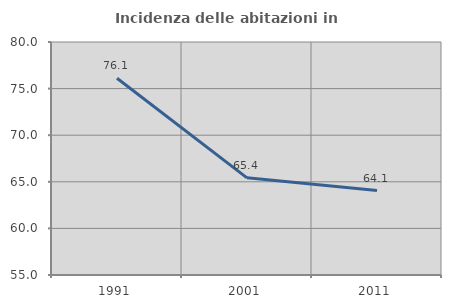
| Category | Incidenza delle abitazioni in proprietà  |
|---|---|
| 1991.0 | 76.116 |
| 2001.0 | 65.427 |
| 2011.0 | 64.062 |